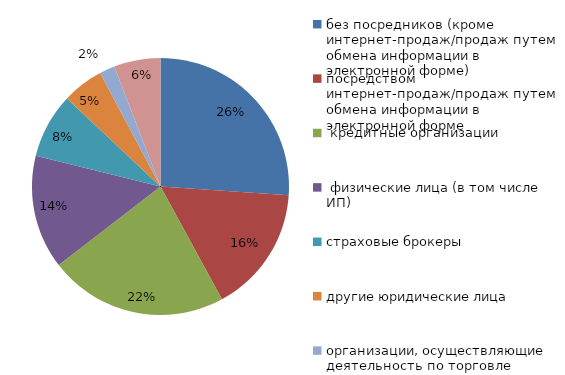
| Category | 1кв2023 |
|---|---|
| без посредников (кроме интернет-продаж/продаж путем обмена информации в электронной форме) | 0.261 |
| посредством интернет-продаж/продаж путем обмена информации в электронной форме | 0.16 |
|  кредитные организации | 0.225 |
|  физические лица (в том числе ИП) | 0.143 |
| страховые брокеры | 0.082 |
| другие юридические лица | 0.052 |
| организации, осуществляющие деятельность по торговле транспортными средствами | 0.019 |
| прочие  | 0.059 |